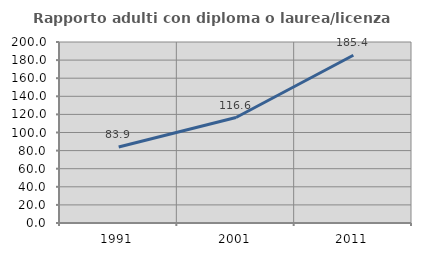
| Category | Rapporto adulti con diploma o laurea/licenza media  |
|---|---|
| 1991.0 | 83.929 |
| 2001.0 | 116.57 |
| 2011.0 | 185.389 |